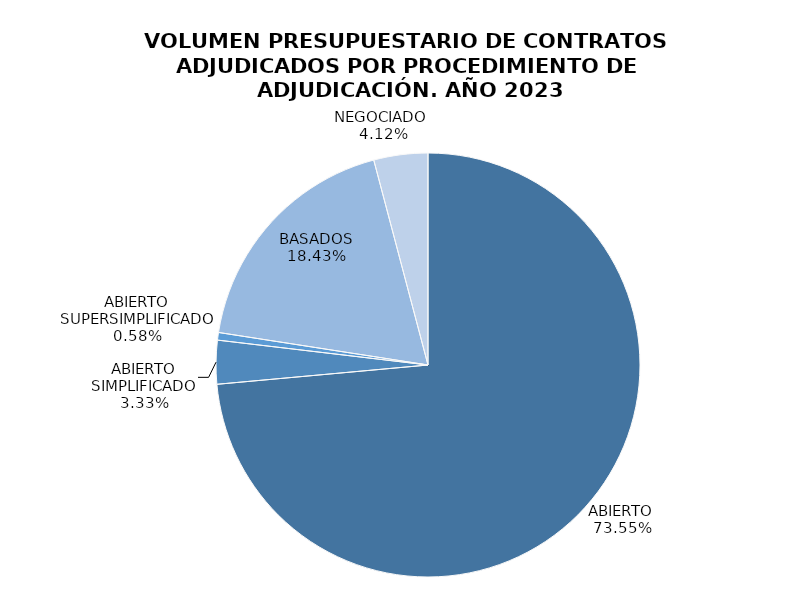
| Category | VOLUMEN PRESUPUESTARIO DE CONTRATOS ADJUDICADOS POR PROCEDIMIENTO DE ADJUDICACIÓN. AÑO 2023 |
|---|---|
| ABIERTO | 73.548 |
| ABIERTO SIMPLIFICADO | 3.326 |
| ABIERTO SUPERSIMPLIFICADO | 0.578 |
| BASADOS | 18.429 |
| NEGOCIADO  | 4.119 |